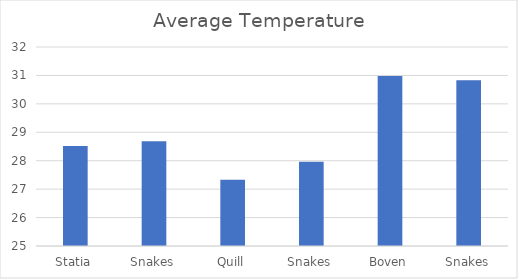
| Category | Average Temperature |
|---|---|
| Statia | 28.516 |
| Snakes | 28.683 |
| Quill | 27.331 |
| Snakes | 27.967 |
| Boven | 30.984 |
| Snakes | 30.833 |